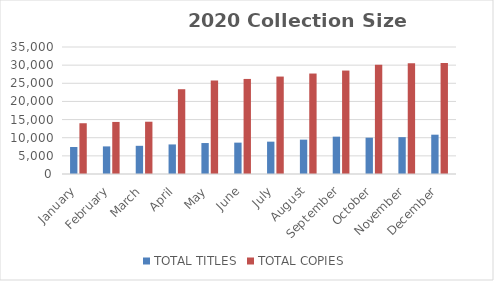
| Category | TOTAL TITLES | TOTAL COPIES |
|---|---|---|
| January | 7436 | 13990 |
| February | 7608 | 14348 |
| March | 7768 | 14409 |
| April | 8148 | 23365 |
| May | 8533 | 25747 |
| June | 8644 | 26199 |
| July | 8913 | 26853 |
| August | 9467 | 27688 |
| September | 10290 | 28508 |
| October | 10012 | 30102 |
| November | 10160 | 30528 |
| December | 10835 | 30595 |